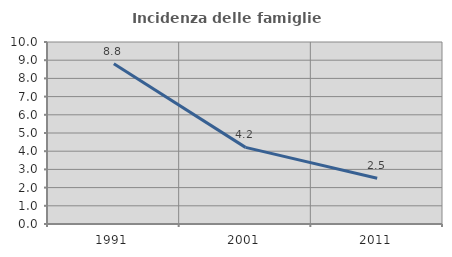
| Category | Incidenza delle famiglie numerose |
|---|---|
| 1991.0 | 8.81 |
| 2001.0 | 4.211 |
| 2011.0 | 2.51 |